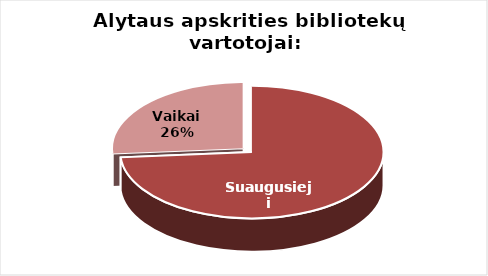
| Category | Series 0 |
|---|---|
| Suaugusieji | 31329 |
| Vaikai | 11161 |